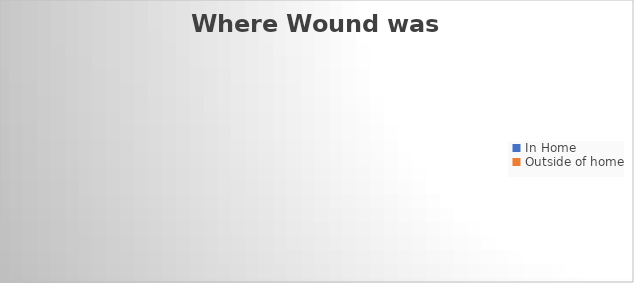
| Category | Series 0 |
|---|---|
| In Home | 0 |
| Outside of home | 0 |